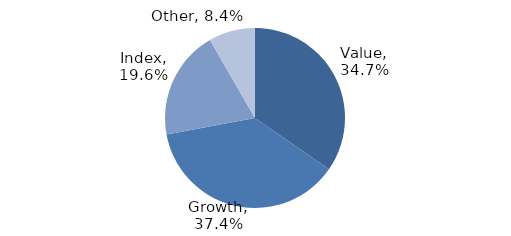
| Category | Investment Style |
|---|---|
| Value | 0.347 |
| Growth | 0.374 |
| Index | 0.196 |
| Other | 0.084 |